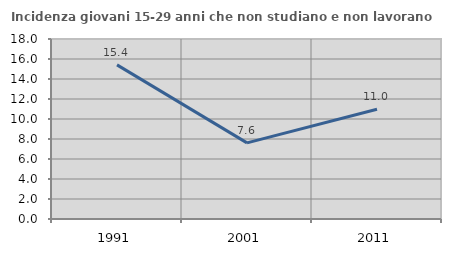
| Category | Incidenza giovani 15-29 anni che non studiano e non lavorano  |
|---|---|
| 1991.0 | 15.411 |
| 2001.0 | 7.614 |
| 2011.0 | 10.983 |